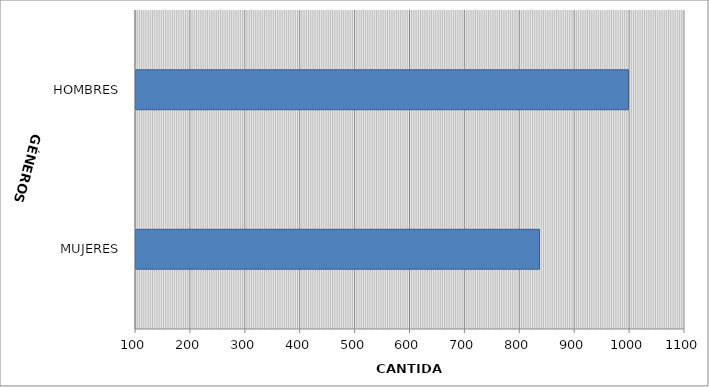
| Category | Series 0 |
|---|---|
| MUJERES | 835 |
| HOMBRES | 997 |